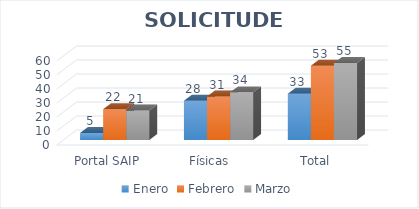
| Category | Enero | Febrero | Marzo |
|---|---|---|---|
| Portal SAIP | 5 | 22 | 21 |
| Físicas  | 28 | 31 | 34 |
| Total | 33 | 53 | 55 |